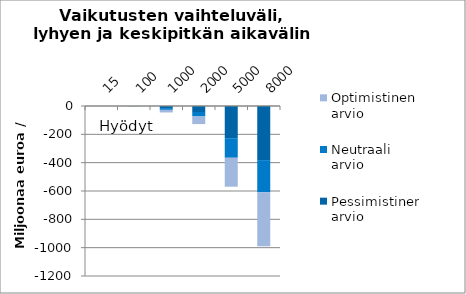
| Category | Pessimistinen arvio | Neutraali arvio | Optimistinen arvio |
|---|---|---|---|
| 15.0 | -0.091 | -0.02 | -0.027 |
| 100.0 | -0.607 | -0.301 | -0.415 |
| 1000.0 | -14.745 | -12.534 | -18.296 |
| 2000.0 | -42.296 | -31.578 | -53.825 |
| 5000.0 | -227.226 | -138.209 | -204.267 |
| 8000.0 | -381.997 | -227.264 | -381.04 |